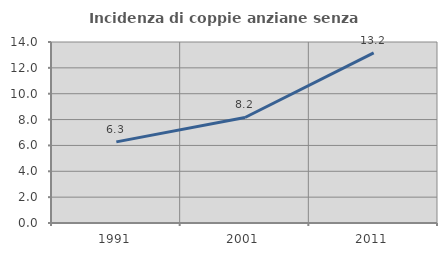
| Category | Incidenza di coppie anziane senza figli  |
|---|---|
| 1991.0 | 6.275 |
| 2001.0 | 8.163 |
| 2011.0 | 13.165 |